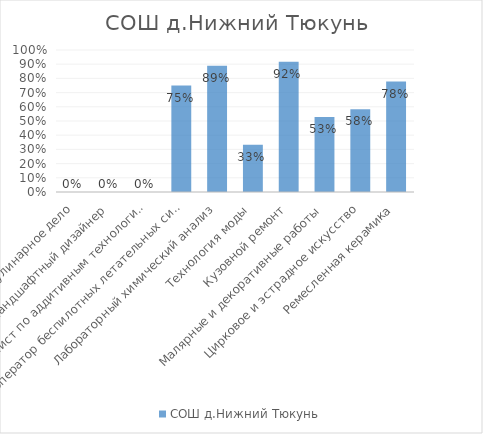
| Category | СОШ д.Нижний Тюкунь |
|---|---|
| Кулинарное дело | 0 |
| Ландшафтный дизайнер | 0 |
| Специалист по аддитивным технологиям | 0 |
| Оператор беспилотных летательных систем | 0.75 |
| Лабораторный химический анализ | 0.889 |
| Технология моды | 0.333 |
| Кузовной ремонт | 0.917 |
| Малярные и декоративные работы | 0.528 |
| Цирковое и эстрадное искусство | 0.583 |
| Ремесленная керамика | 0.778 |